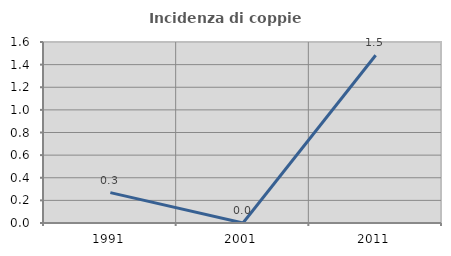
| Category | Incidenza di coppie miste |
|---|---|
| 1991.0 | 0.269 |
| 2001.0 | 0 |
| 2011.0 | 1.483 |